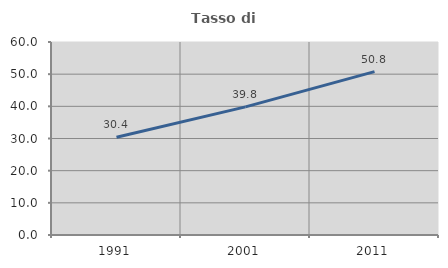
| Category | Tasso di occupazione   |
|---|---|
| 1991.0 | 30.4 |
| 2001.0 | 39.831 |
| 2011.0 | 50.781 |